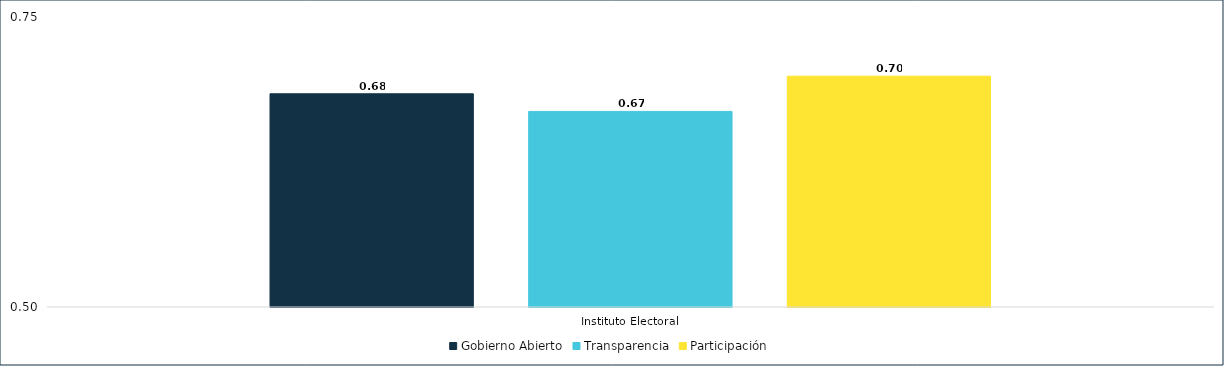
| Category | Gobierno Abierto | Transparencia | Participación |
|---|---|---|---|
| Instituto Electoral | 0.684 | 0.669 | 0.699 |